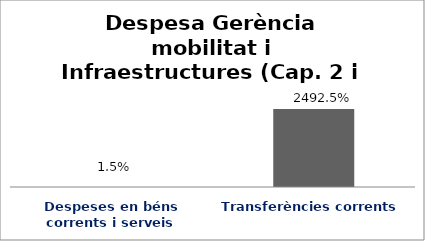
| Category | Series 0 |
|---|---|
| Despeses en béns corrents i serveis | 0.015 |
| Transferències corrents | 24.925 |